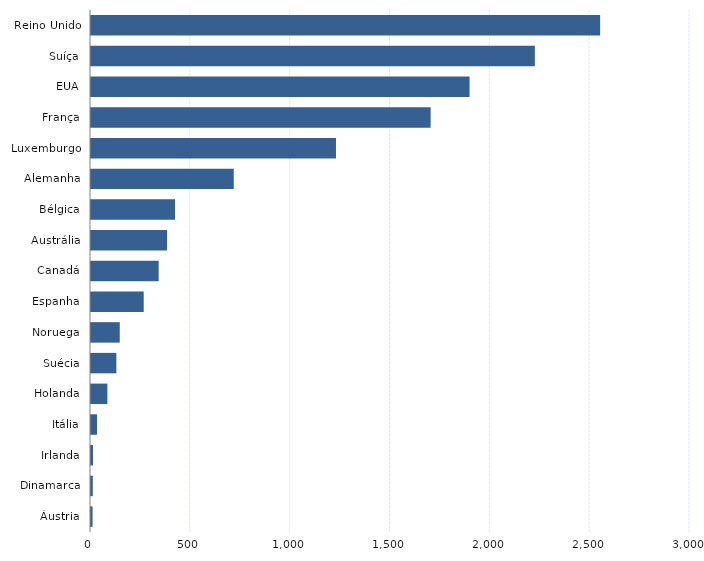
| Category | Series 0 |
|---|---|
| Áustria | 8 |
| Dinamarca | 9 |
| Irlanda | 10 |
| Itália | 30 |
| Holanda | 82 |
| Suécia | 127 |
| Noruega | 144 |
| Espanha | 264 |
| Canadá | 339 |
| Austrália | 381 |
| Bélgica | 421 |
| Alemanha | 715 |
| Luxemburgo | 1227 |
| França | 1701 |
| EUA | 1896 |
| Suíça | 2223 |
| Reino Unido | 2550 |